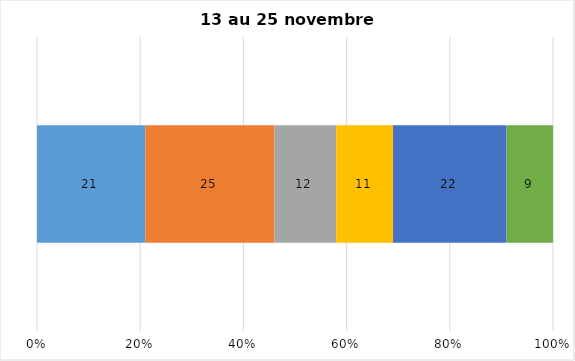
| Category | Plusieurs fois par jour | Une fois par jour | Quelques fois par semaine   | Une fois par semaine ou moins   |  Jamais   |  Je n’utilise pas les médias sociaux |
|---|---|---|---|---|---|---|
| 0 | 21 | 25 | 12 | 11 | 22 | 9 |